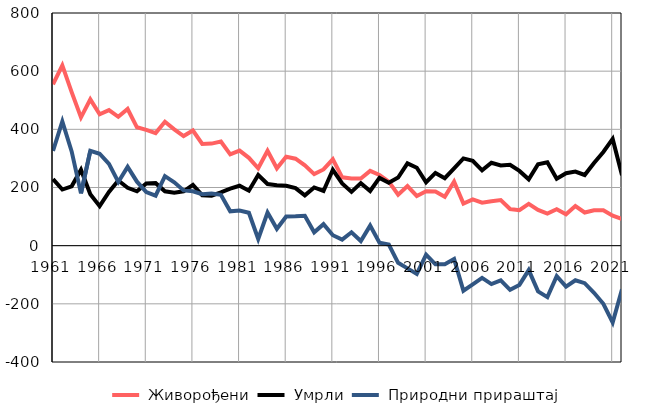
| Category |  Живорођени |  Умрли |  Природни прираштај |
|---|---|---|---|
| 1961.0 | 555 | 229 | 326 |
| 1962.0 | 620 | 193 | 427 |
| 1963.0 | 528 | 204 | 324 |
| 1964.0 | 441 | 261 | 180 |
| 1965.0 | 503 | 177 | 326 |
| 1966.0 | 452 | 136 | 316 |
| 1967.0 | 466 | 185 | 281 |
| 1968.0 | 443 | 224 | 219 |
| 1969.0 | 470 | 199 | 271 |
| 1970.0 | 407 | 187 | 220 |
| 1971.0 | 398 | 214 | 184 |
| 1972.0 | 387 | 215 | 172 |
| 1973.0 | 426 | 187 | 239 |
| 1974.0 | 400 | 182 | 218 |
| 1975.0 | 377 | 187 | 190 |
| 1976.0 | 396 | 209 | 187 |
| 1977.0 | 350 | 173 | 177 |
| 1978.0 | 351 | 172 | 179 |
| 1979.0 | 358 | 183 | 175 |
| 1980.0 | 314 | 196 | 118 |
| 1981.0 | 327 | 206 | 121 |
| 1982.0 | 302 | 189 | 113 |
| 1983.0 | 266 | 243 | 23 |
| 1984.0 | 326 | 212 | 114 |
| 1985.0 | 266 | 208 | 58 |
| 1986.0 | 306 | 206 | 100 |
| 1987.0 | 299 | 198 | 101 |
| 1988.0 | 276 | 173 | 103 |
| 1989.0 | 246 | 200 | 46 |
| 1990.0 | 262 | 188 | 74 |
| 1991.0 | 297 | 261 | 36 |
| 1992.0 | 235 | 214 | 21 |
| 1993.0 | 231 | 185 | 46 |
| 1994.0 | 231 | 215 | 16 |
| 1995.0 | 257 | 188 | 69 |
| 1996.0 | 243 | 233 | 10 |
| 1997.0 | 220 | 216 | 4 |
| 1998.0 | 175 | 234 | -59 |
| 1999.0 | 205 | 283 | -78 |
| 2000.0 | 171 | 268 | -97 |
| 2001.0 | 187 | 218 | -31 |
| 2002.0 | 186 | 250 | -64 |
| 2003.0 | 168 | 232 | -64 |
| 2004.0 | 220 | 266 | -46 |
| 2005.0 | 145 | 300 | -155 |
| 2006.0 | 159 | 292 | -133 |
| 2007.0 | 148 | 259 | -111 |
| 2008.0 | 153 | 285 | -132 |
| 2009.0 | 157 | 276 | -119 |
| 2010.0 | 126 | 278 | -152 |
| 2011.0 | 122 | 257 | -135 |
| 2012.0 | 144 | 228 | -84 |
| 2013.0 | 123 | 280 | -157 |
| 2014.0 | 110 | 287 | -177 |
| 2015.0 | 125 | 230 | -105 |
| 2016.0 | 108 | 249 | -141 |
| 2017.0 | 136 | 255 | -119 |
| 2018.0 | 114 | 243 | -129 |
| 2019.0 | 122 | 284 | -162 |
| 2020.0 | 122 | 322 | -200 |
| 2021.0 | 103 | 367 | -264 |
| 2022.0 | 92 | 242 | -150 |